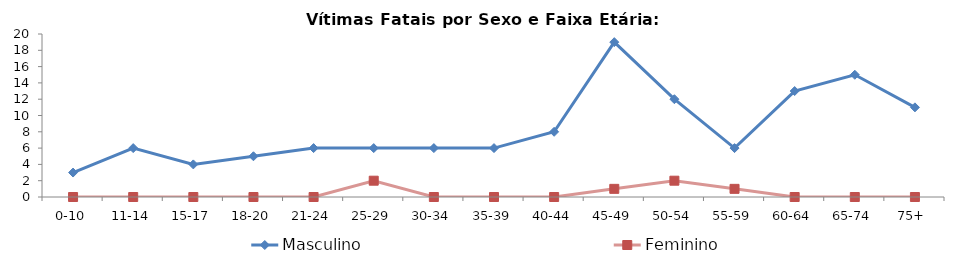
| Category | Masculino | Feminino |
|---|---|---|
| 0-10 | 3 | 0 |
| 11-14 | 6 | 0 |
| 15-17 | 4 | 0 |
| 18-20 | 5 | 0 |
| 21-24 | 6 | 0 |
| 25-29 | 6 | 2 |
| 30-34 | 6 | 0 |
| 35-39 | 6 | 0 |
| 40-44 | 8 | 0 |
| 45-49 | 19 | 1 |
| 50-54 | 12 | 2 |
| 55-59 | 6 | 1 |
| 60-64 | 13 | 0 |
| 65-74 | 15 | 0 |
| 75+ | 11 | 0 |